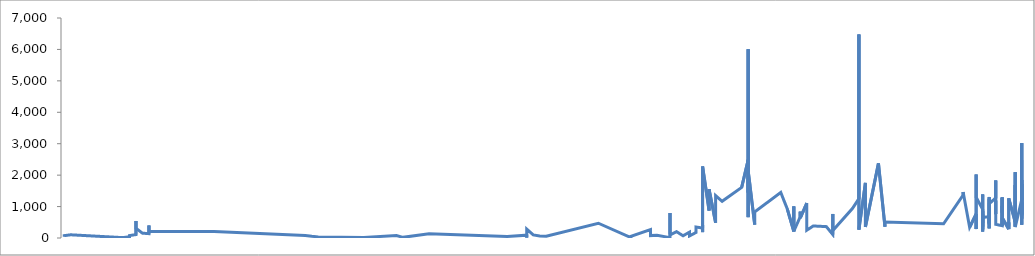
| Category | Series 0 |
|---|---|
| 2014-11-15 | 2480 |
| 2014-11-15 | 2113 |
| 2014-11-15 | 1616 |
| 2014-11-15 | 1225 |
| 2014-11-15 | 1277 |
| 2014-11-15 | 1305 |
| 2014-11-15 | 1012 |
| 2014-11-15 | 767 |
| 2014-11-15 | 1134 |
| 2014-11-15 | 615 |
| 2014-11-15 | 1847 |
| 2014-11-15 | 423 |
| 2014-11-15 | 1722 |
| 2014-11-15 | 719 |
| 2014-11-15 | 3019 |
| 2014-11-15 | 1221 |
| 2014-11-14 | 349 |
| 2014-11-14 | 2094 |
| 2014-11-14 | 370 |
| 2014-11-14 | 1688 |
| 2014-11-14 | 508 |
| 2014-11-13 | 1262 |
| 2014-11-13 | 370 |
| 2014-11-13 | 288 |
| 2014-11-13 | 496 |
| 2014-11-13 | 281 |
| 2014-11-12 | 648 |
| 2014-11-12 | 382 |
| 2014-11-12 | 812 |
| 2014-11-12 | 1272 |
| 2014-11-12 | 821 |
| 2014-11-12 | 383 |
| 2014-11-12 | 1022 |
| 2014-11-12 | 805 |
| 2014-11-12 | 1293 |
| 2014-11-12 | 391 |
| 2014-11-11 | 435 |
| 2014-11-11 | 1194 |
| 2014-11-11 | 759 |
| 2014-11-11 | 737 |
| 2014-11-11 | 1828 |
| 2014-11-11 | 1275 |
| 2014-11-10 | 1088 |
| 2014-11-10 | 1039 |
| 2014-11-10 | 832 |
| 2014-11-10 | 428 |
| 2014-11-10 | 714 |
| 2014-11-10 | 308 |
| 2014-11-10 | 296 |
| 2014-11-10 | 401 |
| 2014-11-10 | 1252 |
| 2014-11-10 | 472 |
| 2014-11-10 | 814 |
| 2014-11-10 | 1306 |
| 2014-11-10 | 679 |
| 2014-11-09 | 653 |
| 2014-11-09 | 599 |
| 2014-11-09 | 362 |
| 2014-11-09 | 752 |
| 2014-11-09 | 271 |
| 2014-11-09 | 1384 |
| 2014-11-09 | 604 |
| 2014-11-09 | 472 |
| 2014-11-09 | 854 |
| 2014-11-09 | 597 |
| 2014-11-09 | 440 |
| 2014-11-09 | 203 |
| 2014-11-09 | 912 |
| 2014-11-08 | 1296 |
| 2014-11-08 | 2020 |
| 2014-11-08 | 285 |
| 2014-11-08 | 763 |
| 2014-11-07 | 339 |
| 2014-11-06 | 1462 |
| 2014-11-06 | 1364 |
| 2014-11-03 | 451 |
| 2014-10-25 | 507 |
| 2014-10-25 | 360 |
| 2014-10-24 | 2376 |
| 2014-10-22 | 350 |
| 2014-10-22 | 1753 |
| 2014-10-21 | 267 |
| 2014-10-21 | 6474 |
| 2014-10-21 | 1251 |
| 2014-10-20 | 937 |
| 2014-10-17 | 236 |
| 2014-10-17 | 766 |
| 2014-10-17 | 107 |
| 2014-10-16 | 362 |
| 2014-10-14 | 383 |
| 2014-10-13 | 249 |
| 2014-10-13 | 1110 |
| 2014-10-12 | 636 |
| 2014-10-12 | 838 |
| 2014-10-12 | 681 |
| 2014-10-11 | 213 |
| 2014-10-11 | 1004 |
| 2014-10-11 | 211 |
| 2014-10-10 | 927 |
| 2014-10-09 | 1450 |
| 2014-10-05 | 829 |
| 2014-10-05 | 426 |
| 2014-10-04 | 2143 |
| 2014-10-04 | 664 |
| 2014-10-04 | 6006 |
| 2014-10-04 | 1446 |
| 2014-10-04 | 2487 |
| 2014-10-03 | 1608 |
| 2014-09-30 | 1167 |
| 2014-09-29 | 1349 |
| 2014-09-29 | 483 |
| 2014-09-28 | 1551 |
| 2014-09-28 | 873 |
| 2014-09-27 | 2276 |
| 2014-09-27 | 188 |
| 2014-09-27 | 214 |
| 2014-09-27 | 425 |
| 2014-09-27 | 317 |
| 2014-09-27 | 293 |
| 2014-09-26 | 349 |
| 2014-09-26 | 178 |
| 2014-09-25 | 66 |
| 2014-09-25 | 155 |
| 2014-09-25 | 187 |
| 2014-09-24 | 71 |
| 2014-09-23 | 202 |
| 2014-09-22 | 99 |
| 2014-09-22 | 794 |
| 2014-09-22 | 123 |
| 2014-09-22 | 11 |
| 2014-09-20 | 90 |
| 2014-09-19 | 77 |
| 2014-09-19 | 266 |
| 2014-09-16 | 51 |
| 2014-09-16 | 13 |
| 2014-09-11 | 470 |
| 2014-09-03 | 58 |
| 2014-09-02 | 64 |
| 2014-09-01 | 98 |
| 2014-08-31 | 284 |
| 2014-08-31 | 12 |
| 2014-08-31 | 91 |
| 2014-08-28 | 50 |
| 2014-08-16 | 133 |
| 2014-08-12 | 21 |
| 2014-08-11 | 79 |
| 2014-08-06 | 18 |
| 2014-07-30 | 35 |
| 2014-07-30 | 14 |
| 2014-07-29 | 56 |
| 2014-07-28 | 83 |
| 2014-07-14 | 205 |
| 2014-07-04 | 206 |
| 2014-07-04 | 397 |
| 2014-07-04 | 138 |
| 2014-07-04 | 162 |
| 2014-07-03 | 154 |
| 2014-07-02 | 310 |
| 2014-07-02 | 542 |
| 2014-07-02 | 109 |
| 2014-07-01 | 76 |
| 2014-07-01 | 67 |
| 2014-07-01 | 40 |
| 2014-06-30 | 12 |
| 2014-06-22 | 102 |
| 2014-06-21 | 75 |
| 2014-06-21 | 38 |
| 2014-06-21 | 57 |
| 2014-06-21 | 7 |
| 2014-06-21 | 33 |